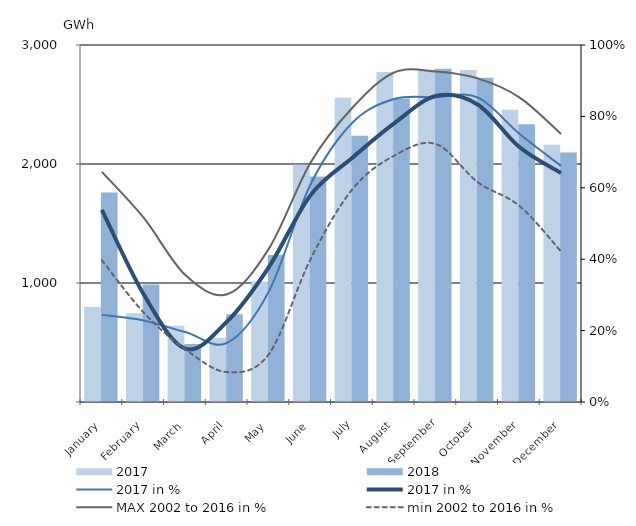
| Category | 2017 | 2018 |
|---|---|---|
| January | 797.806 | 1760.159 |
| February | 746.353 | 987.277 |
| March | 640.388 | 487.809 |
| April | 540.687 | 737.798 |
| May | 1012.729 | 1235.741 |
| June | 1993.429 | 1894.175 |
| July | 2557.003 | 2236.39 |
| August | 2774.029 | 2550.915 |
| September | 2791.259 | 2801.27 |
| October | 2789.297 | 2724.799 |
| November | 2456.526 | 2334.17 |
| December | 2161.535 | 2096.154 |